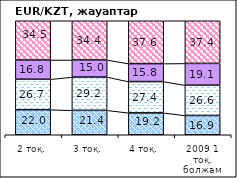
| Category | жоғарылайды | өзгермейді | төмендейді | білмеймін |
|---|---|---|---|---|
| 2 тоқ. | 21.98 | 26.74 | 16.84 | 34.45 |
| 3 тоқ. | 21.43 | 29.19 | 14.97 | 34.41 |
| 4 тоқ.  | 19.19 | 27.44 | 15.76 | 37.61 |
| 2009 1 тоқ. болжам | 16.91 | 26.56 | 19.12 | 37.41 |